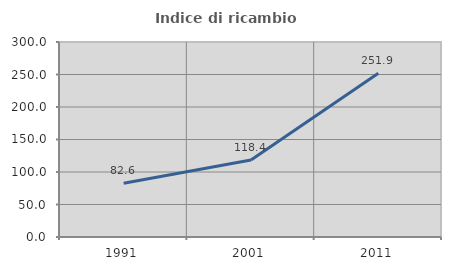
| Category | Indice di ricambio occupazionale  |
|---|---|
| 1991.0 | 82.569 |
| 2001.0 | 118.373 |
| 2011.0 | 251.852 |